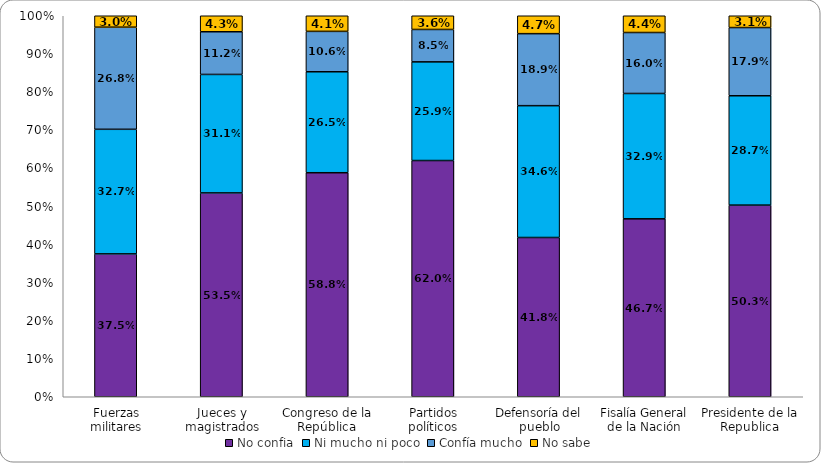
| Category | No confia | Ni mucho ni poco | Confía mucho | No sabe |
|---|---|---|---|---|
| Fuerzas militares | 0.375 | 0.327 | 0.268 | 0.03 |
| Jueces y magistrados | 0.535 | 0.311 | 0.112 | 0.043 |
| Congreso de la República | 0.588 | 0.265 | 0.106 | 0.041 |
| Partidos políticos | 0.62 | 0.259 | 0.085 | 0.036 |
| Defensoría del pueblo | 0.418 | 0.346 | 0.189 | 0.047 |
| Fisalía General de la Nación | 0.467 | 0.329 | 0.16 | 0.044 |
| Presidente de la Republica | 0.503 | 0.287 | 0.179 | 0.031 |